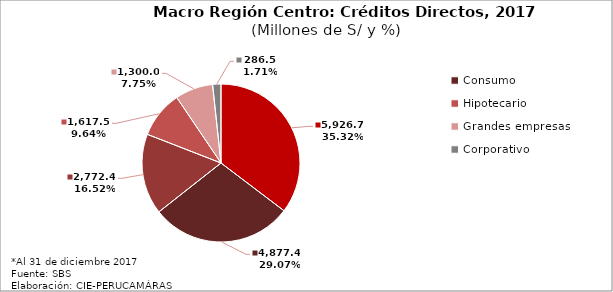
| Category | Series 0 |
|---|---|
| MyPes | 5926.661 |
| Consumo | 4877.371 |
| Medianas empresas | 2772.366 |
| Hipotecario | 1617.459 |
| Grandes empresas | 1299.993 |
| Corporativo | 286.516 |